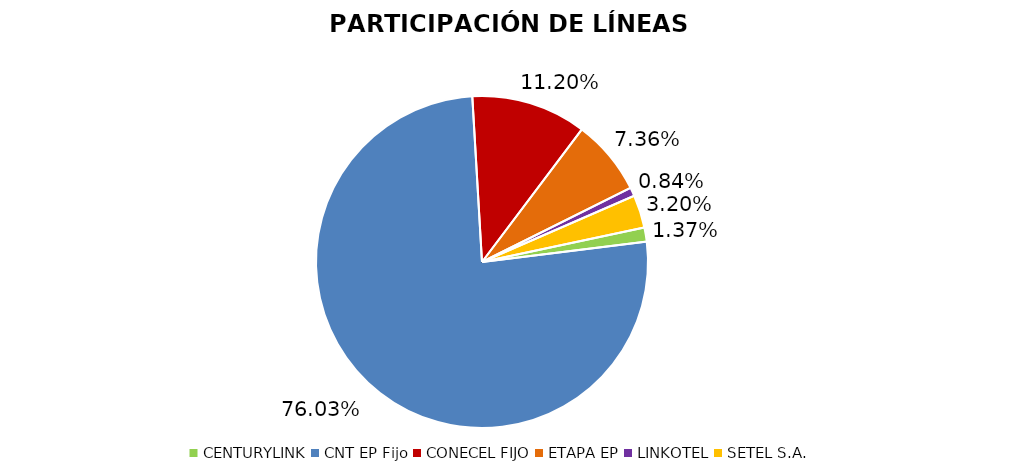
| Category | Participación en el Mercado |
|---|---|
| CENTURYLINK | 0.014 |
| CNT EP Fijo | 0.76 |
| CONECEL FIJO | 0.112 |
| ETAPA EP | 0.074 |
| LINKOTEL | 0.008 |
| SETEL S.A. | 0.032 |